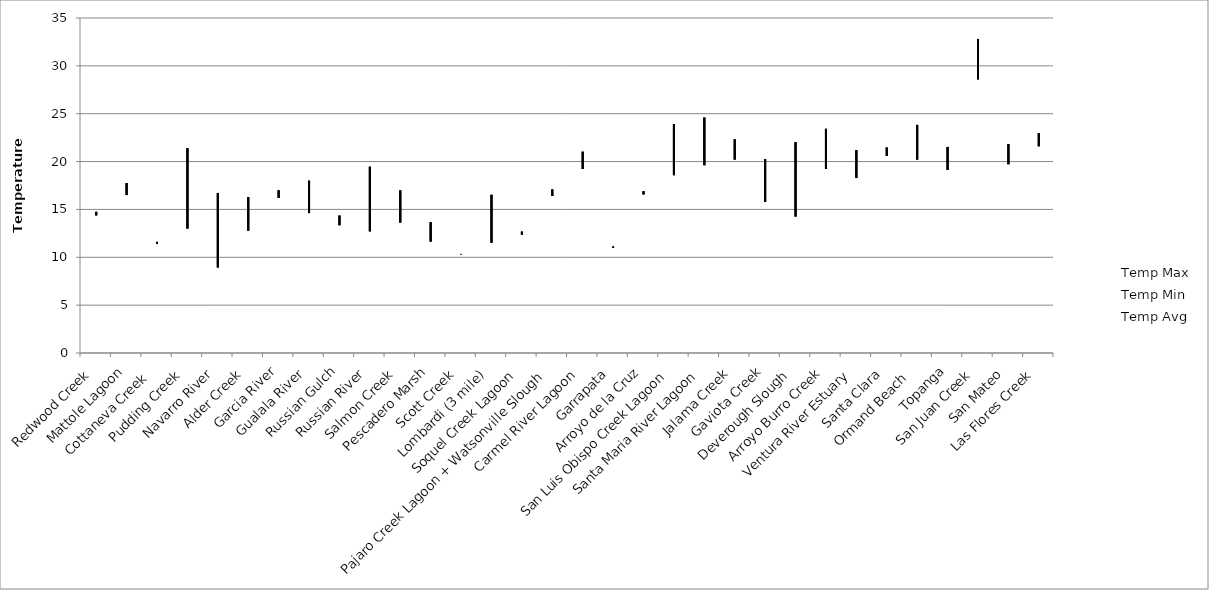
| Category | Temp Max | Temp Min | Temp Avg |
|---|---|---|---|
| Redwood Creek  | 14.75 | 14.38 | 14.524 |
| Mattole Lagoon | 17.75 | 16.5 | 17.247 |
| Cottaneva Creek  | 11.61 | 11.41 | 11.498 |
| Pudding Creek | 21.39 | 13 | 17.274 |
| Navarro River | 16.72 | 8.94 | 12.454 |
| Alder Creek | 16.3 | 12.78 | 14.268 |
| Garcia River | 17 | 16.2 | 16.524 |
| Gualala River | 18 | 14.62 | 15.786 |
| Russian Gulch | 14.36 | 13.35 | 13.514 |
| Russian River | 19.46 | 12.71 | 16.657 |
| Salmon Creek | 16.99 | 13.63 | 14.418 |
| Pescadero Marsh | 13.67 | 11.64 | 12.168 |
| Scott Creek | 10.35 | 10.31 | 10.327 |
| Lombardi (3 mile) | 16.53 | 11.52 | 14.105 |
| Soquel Creek Lagoon | 12.68 | 12.37 | 12.463 |
| Pajaro Creek Lagoon + Watsonville Slough | 17.09 | 16.4 | 16.762 |
| Carmel River Lagoon | 21.03 | 19.23 | 20.491 |
| Garrapata | 11.12 | 11 | 11.042 |
| Arroyo de la Cruz | 16.9 | 16.57 | 16.738 |
| San Luis Obispo Creek Lagoon | 23.91 | 18.58 | 20.48 |
| Santa Maria River Lagoon | 24.6 | 19.62 | 22.196 |
| Jalama Creek | 22.32 | 20.21 | 21.79 |
| Gaviota Creek | 20.26 | 15.8 | 17.472 |
| Deverough Slough | 22.02 | 14.26 | 18.476 |
| Arroyo Burro Creek | 23.42 | 19.24 | 20.874 |
| Ventura River Estuary | 21.2 | 18.28 | 20.015 |
| Santa Clara | 21.47 | 20.6 | 21.091 |
| Ormand Beach  | 23.83 | 20.21 | 21.798 |
| Topanga | 21.53 | 19.13 | 20.797 |
| San Juan Creek | 32.81 | 28.59 | 29.64 |
| San Mateo | 21.82 | 19.72 | 20.818 |
| Las Flores Creek | 22.97 | 21.6 | 22.231 |